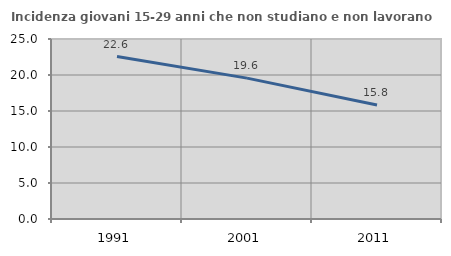
| Category | Incidenza giovani 15-29 anni che non studiano e non lavorano  |
|---|---|
| 1991.0 | 22.568 |
| 2001.0 | 19.565 |
| 2011.0 | 15.827 |